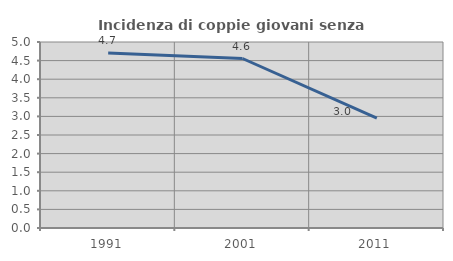
| Category | Incidenza di coppie giovani senza figli |
|---|---|
| 1991.0 | 4.704 |
| 2001.0 | 4.556 |
| 2011.0 | 2.956 |